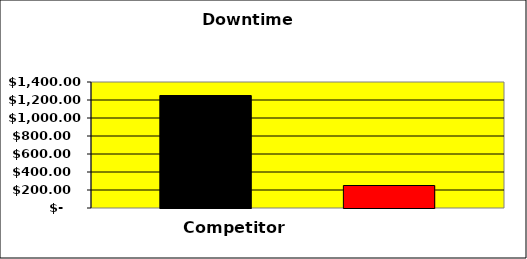
| Category | Series 0 | Series 1 | Series 2 |
|---|---|---|---|
| 0 | 1250 |  | 250 |